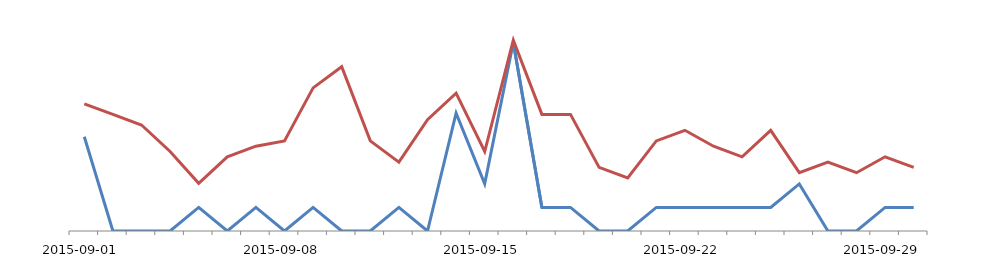
| Category | clicks |
|---|---|
| 2015-09-01 | 4 |
| 2015-09-02 | 0 |
| 2015-09-03 | 0 |
| 2015-09-04 | 0 |
| 2015-09-05 | 1 |
| 2015-09-06 | 0 |
| 2015-09-07 | 1 |
| 2015-09-08 | 0 |
| 2015-09-09 | 1 |
| 2015-09-10 | 0 |
| 2015-09-11 | 0 |
| 2015-09-12 | 1 |
| 2015-09-13 | 0 |
| 2015-09-14 | 5 |
| 2015-09-15 | 2 |
| 2015-09-16 | 8 |
| 2015-09-17 | 1 |
| 2015-09-18 | 1 |
| 2015-09-19 | 0 |
| 2015-09-20 | 0 |
| 2015-09-21 | 1 |
| 2015-09-22 | 1 |
| 2015-09-23 | 1 |
| 2015-09-24 | 1 |
| 2015-09-25 | 1 |
| 2015-09-26 | 2 |
| 2015-09-27 | 0 |
| 2015-09-28 | 0 |
| 2015-09-29 | 1 |
| 2015-09-30 | 1 |